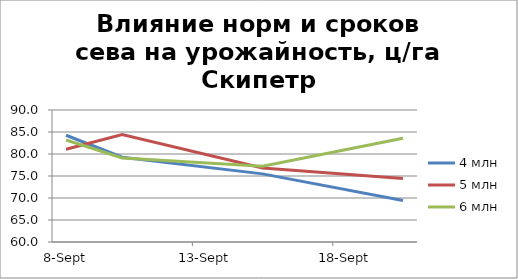
| Category | 4 млн | 5 млн | 6 млн |
|---|---|---|---|
| 2016-09-08 | 84.264 | 81.065 | 83.184 |
| 2016-09-10 | 79.268 | 84.399 | 79.088 |
| 2016-09-15 | 75.487 | 76.837 | 77.242 |
| 2016-09-20 | 69.434 | 74.426 | 83.589 |